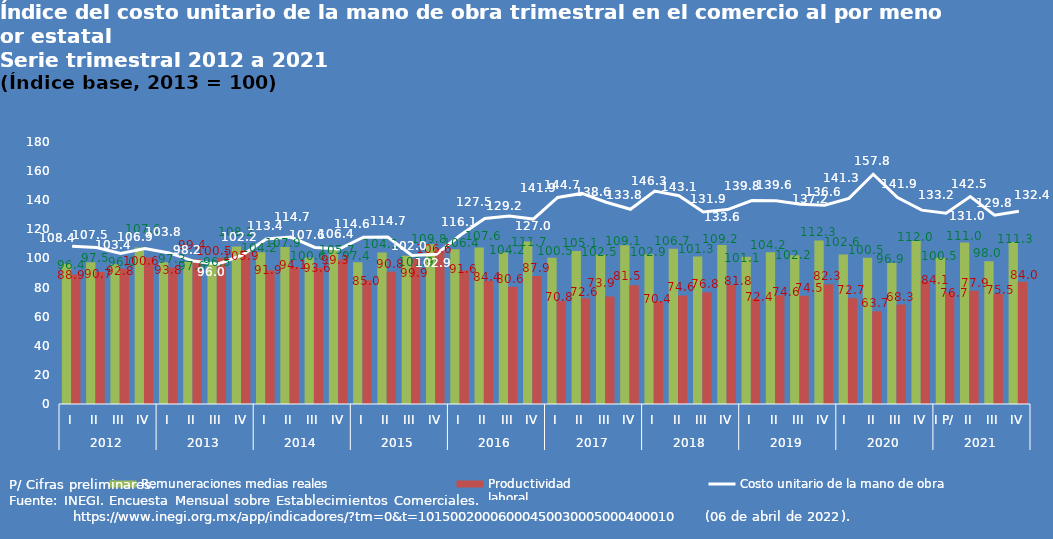
| Category | Remuneraciones medias reales | Productividad 
laboral |
|---|---|---|
| 0 | 96.409 | 88.936 |
| 1 | 97.46 | 90.696 |
| 2 | 96.034 | 92.843 |
| 3 | 107.564 | 100.646 |
| 4 | 97.313 | 93.771 |
| 5 | 97.574 | 99.394 |
| 6 | 96.505 | 100.532 |
| 7 | 108.163 | 105.853 |
| 8 | 104.223 | 91.904 |
| 9 | 107.884 | 94.079 |
| 10 | 100.615 | 93.551 |
| 11 | 105.669 | 99.28 |
| 12 | 97.431 | 85.022 |
| 13 | 104.107 | 90.8 |
| 14 | 101.871 | 99.86 |
| 15 | 109.773 | 106.639 |
| 16 | 106.357 | 91.642 |
| 17 | 107.592 | 84.418 |
| 18 | 104.155 | 80.61 |
| 19 | 111.696 | 87.933 |
| 20 | 100.505 | 70.842 |
| 21 | 105.105 | 72.645 |
| 22 | 102.459 | 73.911 |
| 23 | 109.076 | 81.536 |
| 24 | 102.935 | 70.366 |
| 25 | 106.738 | 74.578 |
| 26 | 101.292 | 76.788 |
| 27 | 109.24 | 81.774 |
| 28 | 101.145 | 72.364 |
| 29 | 104.225 | 74.65 |
| 30 | 102.158 | 74.451 |
| 31 | 112.345 | 82.268 |
| 32 | 102.646 | 72.667 |
| 33 | 100.482 | 63.665 |
| 34 | 96.89 | 68.296 |
| 35 | 112.031 | 84.124 |
| 36 | 100.506 | 76.662 |
| 37 | 110.967 | 77.855 |
| 38 | 98.017 | 75.534 |
| 39 | 111.303 | 84.046 |